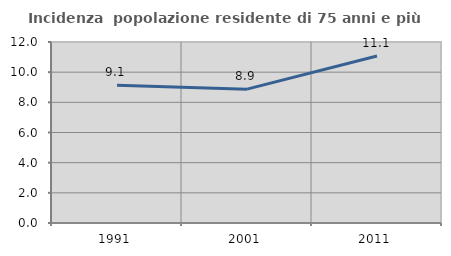
| Category | Incidenza  popolazione residente di 75 anni e più |
|---|---|
| 1991.0 | 9.128 |
| 2001.0 | 8.873 |
| 2011.0 | 11.075 |